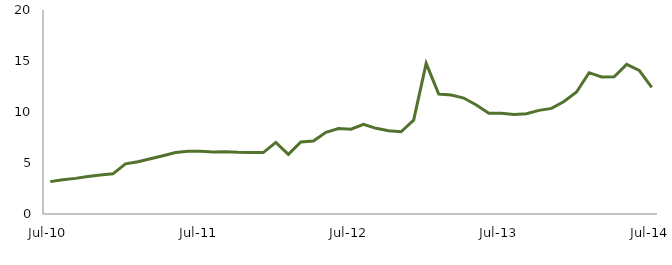
| Category | Series 0 |
|---|---|
| Jul-10 | 3.176 |
|  | 3.366 |
|  | 3.493 |
|  | 3.666 |
|  | 3.83 |
|  | 3.94 |
|  | 4.916 |
|  | 5.126 |
|  | 5.419 |
|  | 5.714 |
|  | 6.026 |
|  | 6.157 |
| Jul-11 | 6.159 |
|  | 6.071 |
|  | 6.101 |
|  | 6.047 |
|  | 6.024 |
|  | 6.023 |
|  | 7.02 |
|  | 5.854 |
|  | 7.066 |
|  | 7.148 |
|  | 8.003 |
|  | 8.373 |
| Jul-12 | 8.316 |
|  | 8.796 |
|  | 8.398 |
|  | 8.159 |
|  | 8.058 |
|  | 9.197 |
|  | 14.769 |
|  | 11.758 |
|  | 11.668 |
|  | 11.366 |
|  | 10.68 |
|  | 9.881 |
| Jul-13 | 9.866 |
|  | 9.756 |
|  | 9.834 |
|  | 10.159 |
|  | 10.356 |
|  | 11.024 |
|  | 11.964 |
|  | 13.855 |
|  | 13.442 |
|  | 13.452 |
|  | 14.665 |
|  | 14.072 |
| Jul-14 | 12.418 |